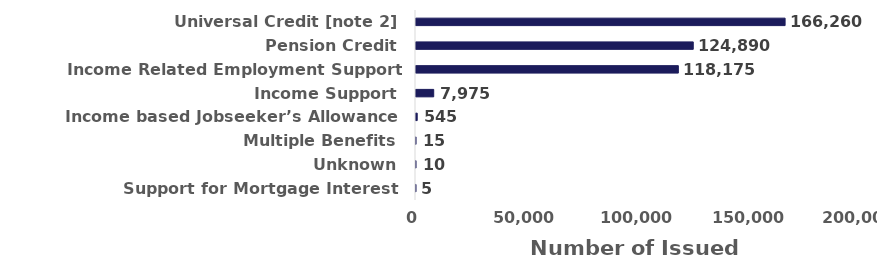
| Category | Number of winter 2023/2024 issued payments |
|---|---|
| Universal Credit [note 2] | 166260 |
| Pension Credit | 124890 |
| Income Related Employment Support Allowance | 118175 |
| Income Support | 7975 |
| Income based Jobseeker’s Allowance | 545 |
| Multiple Benefits | 15 |
| Unknown | 10 |
| Support for Mortgage Interest | 5 |